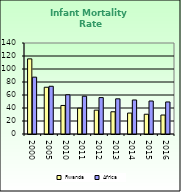
| Category | Rwanda | Africa |
|---|---|---|
| 2000.0 | 115.6 | 87.462 |
| 2005.0 | 71.9 | 73.418 |
| 2010.0 | 43.9 | 60.345 |
| 2011.0 | 39.7 | 58.107 |
| 2012.0 | 36.7 | 56.032 |
| 2013.0 | 34.2 | 54.131 |
| 2014.0 | 32.2 | 52.336 |
| 2015.0 | 30.4 | 50.754 |
| 2016.0 | 29.2 | 49.283 |